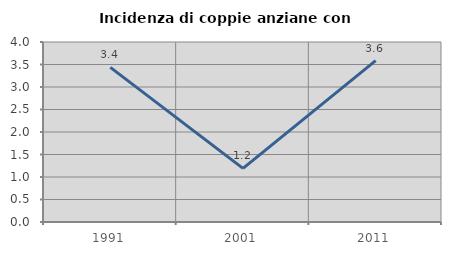
| Category | Incidenza di coppie anziane con figli |
|---|---|
| 1991.0 | 3.435 |
| 2001.0 | 1.19 |
| 2011.0 | 3.586 |